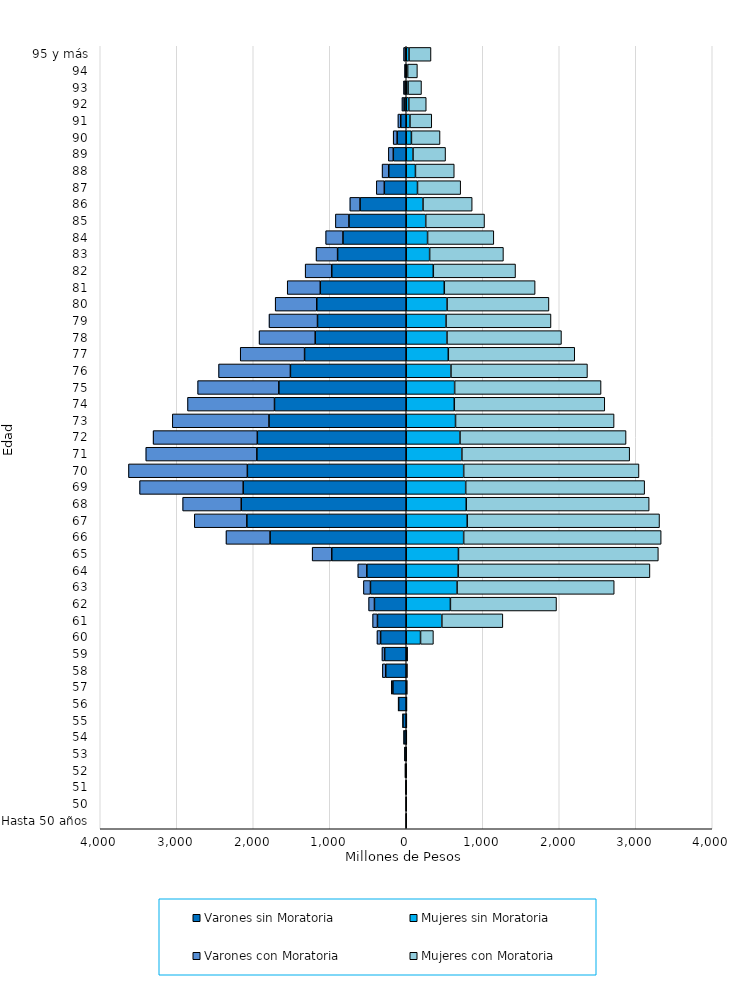
| Category | Varones sin Moratoria | Mujeres sin Moratoria | Varones con Moratoria | Mujeres con Moratoria |
|---|---|---|---|---|
| Hasta 50 años | -1461229 | 1101380 | -117549 | 157398 |
| 50 | -1358324 | 557303 | -38071 | 48793 |
| 51 | -5596048 | 813902 | -101110 | 114212 |
| 52 | -13718367 | 1952094 | -38071 | 38071 |
| 53 | -19953069 | 3136991 | -299703 | 130243 |
| 54 | -30833741 | 3905764 | -926422 | 457868 |
| 55 | -44477325 | 4572581 | -1745266 | 486582 |
| 56 | -99859734 | 5844287 | -5689236 | 597369 |
| 57 | -174724074 | 9253321 | -21047543 | 1356478 |
| 58 | -267850021 | 10631392 | -44313737 | 2550951 |
| 59 | -282324830 | 12848795 | -35121657 | 3969503 |
| 60 | -334968844 | 186560215 | -47439977 | 168544313 |
| 61 | -376291703 | 465364346 | -63412488 | 797435282 |
| 62 | -415787303 | 577161023 | -76183068 | 1386910674 |
| 63 | -467894022 | 664443946 | -91906441 | 2054017271 |
| 64 | -515291672 | 678600654 | -117726426 | 2506804373 |
| 65 | -973546276 | 682265725 | -256405064 | 2612966805 |
| 66 | -1780283022 | 750603348 | -575786405 | 2581588372 |
| 67 | -2083663062 | 796854812 | -686892469 | 2513925285 |
| 68 | -2156896439 | 784279683 | -765775314 | 2391014645 |
| 69 | -2131721434 | 776996013 | -1354050714 | 2339316229 |
| 70 | -2077183541 | 750668932 | -1553926477 | 2291453197 |
| 71 | -1952633403 | 727258146 | -1451919467 | 2193449631 |
| 72 | -1946742312 | 702442435 | -1362330320 | 2170766840 |
| 73 | -1794455573 | 644157142 | -1263601616 | 2072735948 |
| 74 | -1722347483 | 628058230 | -1136737963 | 1967075875 |
| 75 | -1665601595 | 632440867 | -1061191702 | 1914121315 |
| 76 | -1514191606 | 584404809 | -939132453 | 1784199291 |
| 77 | -1329172090 | 549825792 | -841077767 | 1652765605 |
| 78 | -1190359840 | 532508709 | -733316289 | 1496353695 |
| 79 | -1160070361 | 520230579 | -633653945 | 1371794807 |
| 80 | -1169658480 | 533857494 | -543555982 | 1331416775 |
| 81 | -1123585096 | 497149528 | -432185524 | 1187417241 |
| 82 | -973501422 | 353636309 | -347742469 | 1074762006 |
| 83 | -897431578 | 305575619 | -281349898 | 964776982 |
| 84 | -827208912 | 278735160 | -226138864 | 865960825 |
| 85 | -749072758 | 254647601 | -177162960 | 768457212 |
| 86 | -604127414 | 219078382 | -133200817 | 642702769 |
| 87 | -286599821 | 146950999 | -104558133 | 564611092 |
| 88 | -228934043 | 120118870 | -86720874 | 507511778 |
| 89 | -169204478 | 88395784 | -64837098 | 425432597 |
| 90 | -119225571 | 67583249 | -51471936 | 373918144 |
| 91 | -71837112 | 48285781 | -37010069 | 285431713 |
| 92 | -28189119 | 33301692 | -27725592 | 228072886 |
| 93 | -16737024 | 23302247 | -19120309 | 176002212 |
| 94 | -8418516 | 17976140 | -13487957 | 127566113 |
| 95 y más | -10973614 | 36004668 | -23670798 | 287352329 |